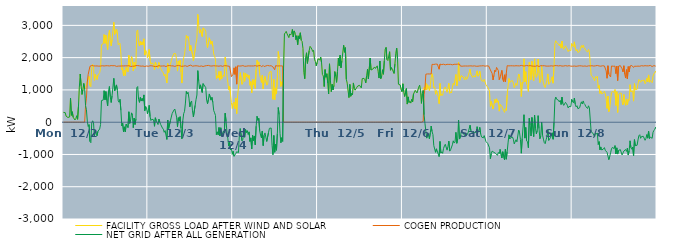
| Category | FACILITY GROSS LOAD AFTER WIND AND SOLAR | COGEN PRODUCTION | NET GRID AFTER ALL GENERATION |
|---|---|---|---|
|  Mon  12/2 | 303 | 0 | 303 |
|  Mon  12/2 | 291 | 0 | 291 |
|  Mon  12/2 | 296 | 0 | 296 |
|  Mon  12/2 | 187 | 0 | 187 |
|  Mon  12/2 | 184 | 0 | 184 |
|  Mon  12/2 | 147 | 0 | 147 |
|  Mon  12/2 | 121 | 0 | 121 |
|  Mon  12/2 | 161 | 0 | 161 |
|  Mon  12/2 | 748 | 0 | 748 |
|  Mon  12/2 | 212 | 0 | 212 |
|  Mon  12/2 | 324 | 0 | 324 |
|  Mon  12/2 | 153 | 0 | 153 |
|  Mon  12/2 | 135 | 0 | 135 |
|  Mon  12/2 | 69 | 0 | 69 |
|  Mon  12/2 | 108 | 0 | 108 |
|  Mon  12/2 | 201 | 0 | 201 |
|  Mon  12/2 | 88 | 0 | 88 |
|  Mon  12/2 | 494 | 0 | 494 |
|  Mon  12/2 | 1087 | 0 | 1087 |
|  Mon  12/2 | 1492 | 0 | 1492 |
|  Mon  12/2 | 1127 | 0 | 1127 |
|  Mon  12/2 | 860 | 0 | 860 |
|  Mon  12/2 | 1006 | 0 | 1006 |
|  Mon  12/2 | 1201 | 0 | 1201 |
|  Mon  12/2 | 1029 | 0 | 1029 |
|  Mon  12/2 | 1028 | 512 | 516 |
|  Mon  12/2 | 1132 | 745 | 387 |
|  Mon  12/2 | 1277 | 1244 | 33 |
|  Mon  12/2 | 1347 | 1481 | -134 |
|  Mon  12/2 | 1421 | 1496 | -75 |
|  Mon  12/2 | 1136 | 1732 | -596 |
|  Mon  12/2 | 1100 | 1735 | -635 |
|  Mon  12/2 | 1732 | 1757 | -25 |
|  Mon  12/2 | 1793 | 1750 | 43 |
|  Mon  12/2 | 1740 | 1745 | -5 |
|  Mon  12/2 | 1295 | 1733 | -438 |
|  Mon  12/2 | 1483 | 1742 | -259 |
|  Mon  12/2 | 1405 | 1735 | -330 |
|  Mon  12/2 | 1321 | 1743 | -422 |
|  Mon  12/2 | 1460 | 1743 | -283 |
|  Mon  12/2 | 1440 | 1736 | -296 |
|  Mon  12/2 | 1535 | 1745 | -210 |
|  Mon  12/2 | 1670 | 1739 | -69 |
|  Mon  12/2 | 2400 | 1731 | 669 |
|  Mon  12/2 | 2413 | 1749 | 664 |
|  Mon  12/2 | 2432 | 1747 | 685 |
|  Mon  12/2 | 2716 | 1741 | 975 |
|  Mon  12/2 | 2443 | 1750 | 693 |
|  Mon  12/2 | 2698 | 1749 | 949 |
|  Mon  12/2 | 2417 | 1745 | 672 |
|  Mon  12/2 | 2251 | 1749 | 502 |
|  Mon  12/2 | 2711 | 1751 | 960 |
|  Mon  12/2 | 2847 | 1742 | 1105 |
|  Mon  12/2 | 2526 | 1739 | 787 |
|  Mon  12/2 | 2364 | 1754 | 610 |
|  Mon  12/2 | 2557 | 1739 | 818 |
|  Mon  12/2 | 2836 | 1748 | 1088 |
|  Mon  12/2 | 3096 | 1738 | 1358 |
|  Mon  12/2 | 2723 | 1752 | 971 |
|  Mon  12/2 | 2697 | 1734 | 963 |
|  Mon  12/2 | 2884 | 1729 | 1155 |
|  Mon  12/2 | 2734 | 1747 | 987 |
|  Mon  12/2 | 2397 | 1738 | 659 |
|  Mon  12/2 | 2383 | 1766 | 617 |
|  Mon  12/2 | 2448 | 1739 | 709 |
|  Mon  12/2 | 2106 | 1740 | 366 |
|  Mon  12/2 | 1624 | 1742 | -118 |
|  Mon  12/2 | 1690 | 1720 | -30 |
|  Mon  12/2 | 1442 | 1743 | -301 |
|  Mon  12/2 | 1607 | 1751 | -144 |
|  Mon  12/2 | 1447 | 1746 | -299 |
|  Mon  12/2 | 1696 | 1754 | -58 |
|  Mon  12/2 | 1682 | 1745 | -63 |
|  Mon  12/2 | 1565 | 1733 | -168 |
|  Mon  12/2 | 2073 | 1751 | 322 |
|  Mon  12/2 | 1709 | 1746 | -37 |
|  Mon  12/2 | 1811 | 1726 | 85 |
|  Mon  12/2 | 2031 | 1743 | 288 |
|  Mon  12/2 | 1953 | 1733 | 220 |
|  Mon  12/2 | 1585 | 1755 | -170 |
|  Mon  12/2 | 1863 | 1737 | 126 |
|  Mon  12/2 | 1667 | 1739 | -72 |
|  Mon  12/2 | 1849 | 1753 | 96 |
|  Mon  12/2 | 2816 | 1746 | 1070 |
|  Mon  12/2 | 2858 | 1754 | 1104 |
|  Mon  12/2 | 2465 | 1763 | 702 |
|  Mon  12/2 | 2359 | 1745 | 614 |
|  Mon  12/2 | 2502 | 1734 | 768 |
|  Mon  12/2 | 2391 | 1736 | 655 |
|  Mon  12/2 | 2491 | 1746 | 745 |
|  Mon  12/2 | 2394 | 1741 | 653 |
|  Mon  12/2 | 2583 | 1738 | 845 |
|  Mon  12/2 | 2078 | 1724 | 354 |
|  Mon  12/2 | 2226 | 1739 | 487 |
|  Mon  12/2 | 2187 | 1742 | 445 |
|  Mon  12/2 | 2004 | 1744 | 260 |
|  Tue  12/3 | 2099 | 1732 | 367 |
|  Tue  12/3 | 2257 | 1734 | 523 |
|  Tue  12/3 | 1919 | 1748 | 171 |
|  Tue  12/3 | 1795 | 1743 | 52 |
|  Tue  12/3 | 1838 | 1746 | 92 |
|  Tue  12/3 | 1833 | 1744 | 89 |
|  Tue  12/3 | 1806 | 1734 | 72 |
|  Tue  12/3 | 1624 | 1751 | -127 |
|  Tue  12/3 | 1859 | 1722 | 137 |
|  Tue  12/3 | 1788 | 1740 | 48 |
|  Tue  12/3 | 1751 | 1728 | 23 |
|  Tue  12/3 | 1670 | 1743 | -73 |
|  Tue  12/3 | 1848 | 1752 | 96 |
|  Tue  12/3 | 1737 | 1738 | -1 |
|  Tue  12/3 | 1667 | 1738 | -71 |
|  Tue  12/3 | 1685 | 1729 | -44 |
|  Tue  12/3 | 1559 | 1741 | -182 |
|  Tue  12/3 | 1527 | 1743 | -216 |
|  Tue  12/3 | 1432 | 1745 | -313 |
|  Tue  12/3 | 1487 | 1748 | -261 |
|  Tue  12/3 | 1457 | 1724 | -267 |
|  Tue  12/3 | 1215 | 1749 | -534 |
|  Tue  12/3 | 1817 | 1751 | 66 |
|  Tue  12/3 | 1534 | 1732 | -198 |
|  Tue  12/3 | 1576 | 1756 | -180 |
|  Tue  12/3 | 1783 | 1740 | 43 |
|  Tue  12/3 | 1904 | 1745 | 159 |
|  Tue  12/3 | 2001 | 1733 | 268 |
|  Tue  12/3 | 2000 | 1744 | 256 |
|  Tue  12/3 | 2130 | 1754 | 376 |
|  Tue  12/3 | 2135 | 1728 | 407 |
|  Tue  12/3 | 2123 | 1741 | 382 |
|  Tue  12/3 | 1905 | 1749 | 156 |
|  Tue  12/3 | 1583 | 1724 | -141 |
|  Tue  12/3 | 1897 | 1758 | 139 |
|  Tue  12/3 | 1767 | 1735 | 32 |
|  Tue  12/3 | 1916 | 1746 | 170 |
|  Tue  12/3 | 1554 | 1737 | -183 |
|  Tue  12/3 | 1213 | 1729 | -516 |
|  Tue  12/3 | 1779 | 1740 | 39 |
|  Tue  12/3 | 2000 | 1738 | 262 |
|  Tue  12/3 | 2092 | 1755 | 337 |
|  Tue  12/3 | 2340 | 1748 | 592 |
|  Tue  12/3 | 2687 | 1735 | 952 |
|  Tue  12/3 | 2603 | 1727 | 876 |
|  Tue  12/3 | 2665 | 1739 | 926 |
|  Tue  12/3 | 2494 | 1751 | 743 |
|  Tue  12/3 | 2207 | 1732 | 475 |
|  Tue  12/3 | 2378 | 1767 | 611 |
|  Tue  12/3 | 2405 | 1748 | 657 |
|  Tue  12/3 | 2085 | 1734 | 351 |
|  Tue  12/3 | 1905 | 1744 | 161 |
|  Tue  12/3 | 1904 | 1744 | 160 |
|  Tue  12/3 | 2265 | 1743 | 522 |
|  Tue  12/3 | 2450 | 1748 | 702 |
|  Tue  12/3 | 2589 | 1747 | 842 |
|  Tue  12/3 | 3339 | 1742 | 1597 |
|  Tue  12/3 | 3026 | 1743 | 1283 |
|  Tue  12/3 | 2759 | 1730 | 1029 |
|  Tue  12/3 | 2878 | 1722 | 1156 |
|  Tue  12/3 | 2878 | 1743 | 1135 |
|  Tue  12/3 | 2654 | 1733 | 921 |
|  Tue  12/3 | 2920 | 1724 | 1196 |
|  Tue  12/3 | 2902 | 1749 | 1153 |
|  Tue  12/3 | 2880 | 1742 | 1138 |
|  Tue  12/3 | 2819 | 1749 | 1070 |
|  Tue  12/3 | 2436 | 1752 | 684 |
|  Tue  12/3 | 2312 | 1740 | 572 |
|  Tue  12/3 | 2468 | 1759 | 709 |
|  Tue  12/3 | 2615 | 1740 | 875 |
|  Tue  12/3 | 2621 | 1742 | 879 |
|  Tue  12/3 | 2414 | 1732 | 682 |
|  Tue  12/3 | 2512 | 1740 | 772 |
|  Tue  12/3 | 2360 | 1748 | 612 |
|  Tue  12/3 | 2108 | 1749 | 359 |
|  Tue  12/3 | 2036 | 1745 | 291 |
|  Tue  12/3 | 1952 | 1744 | 208 |
|  Tue  12/3 | 1350 | 1736 | -386 |
|  Tue  12/3 | 1443 | 1741 | -298 |
|  Tue  12/3 | 1367 | 1760 | -393 |
|  Tue  12/3 | 1570 | 1735 | -165 |
|  Tue  12/3 | 1302 | 1730 | -428 |
|  Tue  12/3 | 1575 | 1748 | -173 |
|  Tue  12/3 | 1341 | 1754 | -413 |
|  Tue  12/3 | 1385 | 1730 | -345 |
|  Tue  12/3 | 1467 | 1740 | -273 |
|  Tue  12/3 | 1418 | 1750 | -332 |
|  Tue  12/3 | 2014 | 1736 | 278 |
|  Tue  12/3 | 1773 | 1749 | 24 |
|  Tue  12/3 | 1424 | 1743 | -319 |
|  Tue  12/3 | 1223 | 1738 | -515 |
|  Tue  12/3 | 1010 | 1751 | -741 |
|  Tue  12/3 | 1107 | 1731 | -624 |
|  Tue  12/3 | 869 | 1727 | -858 |
|  Tue  12/3 | 606 | 1411 | -805 |
|  Tue  12/3 | 426 | 1422 | -996 |
|  Wed  12/4 | 582 | 1486 | -904 |
|  Wed  12/4 | 627 | 1684 | -1057 |
|  Wed  12/4 | 417 | 1481 | -1064 |
|  Wed  12/4 | 748 | 1717 | -969 |
|  Wed  12/4 | 264 | 1179 | -915 |
|  Wed  12/4 | 805 | 1746 | -941 |
|  Wed  12/4 | 805 | 1748 | -943 |
|  Wed  12/4 | 1332 | 1739 | -407 |
|  Wed  12/4 | 1536 | 1735 | -199 |
|  Wed  12/4 | 1542 | 1741 | -199 |
|  Wed  12/4 | 1172 | 1746 | -574 |
|  Wed  12/4 | 1220 | 1753 | -533 |
|  Wed  12/4 | 1533 | 1758 | -225 |
|  Wed  12/4 | 1266 | 1732 | -466 |
|  Wed  12/4 | 1524 | 1751 | -227 |
|  Wed  12/4 | 1413 | 1735 | -322 |
|  Wed  12/4 | 1480 | 1741 | -261 |
|  Wed  12/4 | 1361 | 1745 | -384 |
|  Wed  12/4 | 1451 | 1750 | -299 |
|  Wed  12/4 | 1145 | 1742 | -597 |
|  Wed  12/4 | 1257 | 1744 | -487 |
|  Wed  12/4 | 913 | 1742 | -829 |
|  Wed  12/4 | 1324 | 1732 | -408 |
|  Wed  12/4 | 1170 | 1742 | -572 |
|  Wed  12/4 | 1312 | 1739 | -427 |
|  Wed  12/4 | 1050 | 1752 | -702 |
|  Wed  12/4 | 1631 | 1755 | -124 |
|  Wed  12/4 | 1919 | 1736 | 183 |
|  Wed  12/4 | 1788 | 1733 | 55 |
|  Wed  12/4 | 1871 | 1751 | 120 |
|  Wed  12/4 | 1478 | 1743 | -265 |
|  Wed  12/4 | 1354 | 1753 | -399 |
|  Wed  12/4 | 1231 | 1720 | -489 |
|  Wed  12/4 | 1459 | 1732 | -273 |
|  Wed  12/4 | 1030 | 1756 | -726 |
|  Wed  12/4 | 1315 | 1724 | -409 |
|  Wed  12/4 | 1416 | 1748 | -332 |
|  Wed  12/4 | 1415 | 1742 | -327 |
|  Wed  12/4 | 1148 | 1745 | -597 |
|  Wed  12/4 | 1180 | 1758 | -578 |
|  Wed  12/4 | 1427 | 1748 | -321 |
|  Wed  12/4 | 1554 | 1745 | -191 |
|  Wed  12/4 | 1553 | 1747 | -194 |
|  Wed  12/4 | 1569 | 1749 | -180 |
|  Wed  12/4 | 1034 | 1752 | -718 |
|  Wed  12/4 | 707 | 1714 | -1007 |
|  Wed  12/4 | 1328 | 1740 | -412 |
|  Wed  12/4 | 694 | 1626 | -932 |
|  Wed  12/4 | 1063 | 1751 | -688 |
|  Wed  12/4 | 872 | 1742 | -870 |
|  Wed  12/4 | 1391 | 1742 | -351 |
|  Wed  12/4 | 2190 | 1736 | 454 |
|  Wed  12/4 | 1981 | 1744 | 237 |
|  Wed  12/4 | 1390 | 1734 | -344 |
|  Wed  12/4 | 1106 | 1744 | -638 |
|  Wed  12/4 | 1252 | 1732 | -480 |
|  Wed  12/4 | 1148 | 1742 | -594 |
|  Wed  12/4 | 1646 | 0 | 1646 |
|  Wed  12/4 | 2733 | 0 | 2733 |
|  Wed  12/4 | 2771 | 0 | 2771 |
|  Wed  12/4 | 2813 | 0 | 2813 |
|  Wed  12/4 | 2739 | 0 | 2739 |
|  Wed  12/4 | 2721 | 0 | 2721 |
|  Wed  12/4 | 2621 | 0 | 2621 |
|  Wed  12/4 | 2735 | 0 | 2735 |
|  Wed  12/4 | 2699 | 0 | 2699 |
|  Wed  12/4 | 2751 | 0 | 2751 |
|  Wed  12/4 | 2873 | 0 | 2873 |
|  Wed  12/4 | 2640 | 0 | 2640 |
|  Wed  12/4 | 2829 | 0 | 2829 |
|  Wed  12/4 | 2769 | 0 | 2769 |
|  Wed  12/4 | 2556 | 0 | 2556 |
|  Wed  12/4 | 2679 | 0 | 2679 |
|  Wed  12/4 | 2401 | 0 | 2401 |
|  Wed  12/4 | 2674 | 0 | 2674 |
|  Wed  12/4 | 2589 | 0 | 2589 |
|  Wed  12/4 | 2770 | 0 | 2770 |
|  Wed  12/4 | 2536 | 0 | 2536 |
|  Wed  12/4 | 2502 | 0 | 2502 |
|  Wed  12/4 | 2280 | 0 | 2280 |
|  Wed  12/4 | 1541 | 0 | 1541 |
|  Wed  12/4 | 1347 | 0 | 1347 |
|  Wed  12/4 | 1995 | 0 | 1995 |
|  Wed  12/4 | 2150 | 0 | 2150 |
|  Wed  12/4 | 1821 | 0 | 1821 |
|  Wed  12/4 | 1804 | 0 | 1804 |
|  Wed  12/4 | 2217 | 0 | 2217 |
|  Wed  12/4 | 2348 | 0 | 2348 |
|  Wed  12/4 | 2312 | 0 | 2312 |
|  Wed  12/4 | 2263 | 0 | 2263 |
|  Wed  12/4 | 2191 | 0 | 2191 |
|  Wed  12/4 | 2225 | 0 | 2225 |
|  Wed  12/4 | 1951 | 0 | 1951 |
|  Wed  12/4 | 1880 | 0 | 1880 |
|  Wed  12/4 | 1747 | 0 | 1747 |
|  Wed  12/4 | 1847 | 0 | 1847 |
|  Thu  12/5 | 1964 | 0 | 1964 |
|  Thu  12/5 | 1984 | 0 | 1984 |
|  Thu  12/5 | 1928 | 0 | 1928 |
|  Thu  12/5 | 2014 | 0 | 2014 |
|  Thu  12/5 | 1844 | 0 | 1844 |
|  Thu  12/5 | 1475 | 0 | 1475 |
|  Thu  12/5 | 1434 | 0 | 1434 |
|  Thu  12/5 | 1105 | 0 | 1105 |
|  Thu  12/5 | 1630 | 0 | 1630 |
|  Thu  12/5 | 1392 | 0 | 1392 |
|  Thu  12/5 | 1501 | 0 | 1501 |
|  Thu  12/5 | 1212 | 0 | 1212 |
|  Thu  12/5 | 874 | 0 | 874 |
|  Thu  12/5 | 1808 | 0 | 1808 |
|  Thu  12/5 | 1310 | 0 | 1310 |
|  Thu  12/5 | 946 | 0 | 946 |
|  Thu  12/5 | 1173 | 0 | 1173 |
|  Thu  12/5 | 1003 | 0 | 1003 |
|  Thu  12/5 | 1140 | 0 | 1140 |
|  Thu  12/5 | 1568 | 0 | 1568 |
|  Thu  12/5 | 1431 | 0 | 1431 |
|  Thu  12/5 | 1234 | 0 | 1234 |
|  Thu  12/5 | 1570 | 0 | 1570 |
|  Thu  12/5 | 1986 | 0 | 1986 |
|  Thu  12/5 | 1747 | 0 | 1747 |
|  Thu  12/5 | 2075 | 0 | 2075 |
|  Thu  12/5 | 1685 | 0 | 1685 |
|  Thu  12/5 | 1906 | 0 | 1906 |
|  Thu  12/5 | 1924 | 0 | 1924 |
|  Thu  12/5 | 2383 | 0 | 2383 |
|  Thu  12/5 | 2166 | 0 | 2166 |
|  Thu  12/5 | 2309 | 0 | 2309 |
|  Thu  12/5 | 1330 | 0 | 1330 |
|  Thu  12/5 | 1211 | 0 | 1211 |
|  Thu  12/5 | 1219 | 0 | 1219 |
|  Thu  12/5 | 763 | 0 | 763 |
|  Thu  12/5 | 1169 | 0 | 1169 |
|  Thu  12/5 | 803 | 0 | 803 |
|  Thu  12/5 | 889 | 0 | 889 |
|  Thu  12/5 | 847 | 0 | 847 |
|  Thu  12/5 | 1216 | 0 | 1216 |
|  Thu  12/5 | 1041 | 0 | 1041 |
|  Thu  12/5 | 992 | 0 | 992 |
|  Thu  12/5 | 995 | 0 | 995 |
|  Thu  12/5 | 1084 | 0 | 1084 |
|  Thu  12/5 | 1122 | 0 | 1122 |
|  Thu  12/5 | 1117 | 0 | 1117 |
|  Thu  12/5 | 1141 | 0 | 1141 |
|  Thu  12/5 | 1160 | 0 | 1160 |
|  Thu  12/5 | 1062 | 0 | 1062 |
|  Thu  12/5 | 1349 | 0 | 1349 |
|  Thu  12/5 | 1344 | 0 | 1344 |
|  Thu  12/5 | 1358 | 0 | 1358 |
|  Thu  12/5 | 1315 | 0 | 1315 |
|  Thu  12/5 | 1218 | 0 | 1218 |
|  Thu  12/5 | 1440 | 0 | 1440 |
|  Thu  12/5 | 1639 | 0 | 1639 |
|  Thu  12/5 | 1339 | 0 | 1339 |
|  Thu  12/5 | 1366 | 0 | 1366 |
|  Thu  12/5 | 1985 | 0 | 1985 |
|  Thu  12/5 | 1616 | 0 | 1616 |
|  Thu  12/5 | 1596 | 0 | 1596 |
|  Thu  12/5 | 1644 | 0 | 1644 |
|  Thu  12/5 | 1632 | 0 | 1632 |
|  Thu  12/5 | 1711 | 0 | 1711 |
|  Thu  12/5 | 1666 | 0 | 1666 |
|  Thu  12/5 | 1645 | 0 | 1645 |
|  Thu  12/5 | 1746 | 0 | 1746 |
|  Thu  12/5 | 1576 | 0 | 1576 |
|  Thu  12/5 | 1368 | 0 | 1368 |
|  Thu  12/5 | 1895 | 0 | 1895 |
|  Thu  12/5 | 1349 | 0 | 1349 |
|  Thu  12/5 | 1425 | 0 | 1425 |
|  Thu  12/5 | 1625 | 0 | 1625 |
|  Thu  12/5 | 1485 | 0 | 1485 |
|  Thu  12/5 | 1899 | 0 | 1899 |
|  Thu  12/5 | 2258 | 0 | 2258 |
|  Thu  12/5 | 2317 | 0 | 2317 |
|  Thu  12/5 | 1942 | 0 | 1942 |
|  Thu  12/5 | 1910 | 0 | 1910 |
|  Thu  12/5 | 1892 | 0 | 1892 |
|  Thu  12/5 | 2183 | 0 | 2183 |
|  Thu  12/5 | 1611 | 0 | 1611 |
|  Thu  12/5 | 1691 | 0 | 1691 |
|  Thu  12/5 | 1642 | 0 | 1642 |
|  Thu  12/5 | 1631 | 0 | 1631 |
|  Thu  12/5 | 1511 | 0 | 1511 |
|  Thu  12/5 | 1799 | 0 | 1799 |
|  Thu  12/5 | 2138 | 0 | 2138 |
|  Thu  12/5 | 2296 | 0 | 2296 |
|  Thu  12/5 | 1937 | 0 | 1937 |
|  Thu  12/5 | 1177 | 0 | 1177 |
|  Thu  12/5 | 1175 | 0 | 1175 |
|  Thu  12/5 | 1154 | 0 | 1154 |
|  Thu  12/5 | 1012 | 0 | 1012 |
|  Thu  12/5 | 945 | 0 | 945 |
|  Fri  12/6 | 1189 | 0 | 1189 |
|  Fri  12/6 | 944 | 0 | 944 |
|  Fri  12/6 | 796 | 0 | 796 |
|  Fri  12/6 | 800 | 0 | 800 |
|  Fri  12/6 | 1041 | 0 | 1041 |
|  Fri  12/6 | 561 | 0 | 561 |
|  Fri  12/6 | 784 | 0 | 784 |
|  Fri  12/6 | 607 | 0 | 607 |
|  Fri  12/6 | 649 | 0 | 649 |
|  Fri  12/6 | 591 | 0 | 591 |
|  Fri  12/6 | 712 | 0 | 712 |
|  Fri  12/6 | 629 | 0 | 629 |
|  Fri  12/6 | 870 | 0 | 870 |
|  Fri  12/6 | 889 | 0 | 889 |
|  Fri  12/6 | 984 | 0 | 984 |
|  Fri  12/6 | 971 | 0 | 971 |
|  Fri  12/6 | 906 | 0 | 906 |
|  Fri  12/6 | 908 | 0 | 908 |
|  Fri  12/6 | 1088 | 0 | 1088 |
|  Fri  12/6 | 1147 | 0 | 1147 |
|  Fri  12/6 | 972 | 0 | 972 |
|  Fri  12/6 | 584 | 0 | 584 |
|  Fri  12/6 | 888 | 0 | 888 |
|  Fri  12/6 | 1004 | 22 | 982 |
|  Fri  12/6 | 1078 | 848 | 230 |
|  Fri  12/6 | 1001 | 1043 | -42 |
|  Fri  12/6 | 1206 | 1488 | -282 |
|  Fri  12/6 | 1007 | 1501 | -494 |
|  Fri  12/6 | 1160 | 1495 | -335 |
|  Fri  12/6 | 1093 | 1502 | -409 |
|  Fri  12/6 | 978 | 1494 | -516 |
|  Fri  12/6 | 1145 | 1483 | -338 |
|  Fri  12/6 | 1373 | 1493 | -120 |
|  Fri  12/6 | 1503 | 1792 | -289 |
|  Fri  12/6 | 1396 | 1780 | -384 |
|  Fri  12/6 | 1061 | 1789 | -728 |
|  Fri  12/6 | 1095 | 1799 | -704 |
|  Fri  12/6 | 866 | 1799 | -933 |
|  Fri  12/6 | 977 | 1802 | -825 |
|  Fri  12/6 | 955 | 1798 | -843 |
|  Fri  12/6 | 790 | 1779 | -989 |
|  Fri  12/6 | 575 | 1641 | -1066 |
|  Fri  12/6 | 1200 | 1798 | -598 |
|  Fri  12/6 | 823 | 1781 | -958 |
|  Fri  12/6 | 866 | 1785 | -919 |
|  Fri  12/6 | 830 | 1796 | -966 |
|  Fri  12/6 | 981 | 1796 | -815 |
|  Fri  12/6 | 1060 | 1795 | -735 |
|  Fri  12/6 | 1092 | 1777 | -685 |
|  Fri  12/6 | 1080 | 1787 | -707 |
|  Fri  12/6 | 926 | 1793 | -867 |
|  Fri  12/6 | 1046 | 1799 | -753 |
|  Fri  12/6 | 1203 | 1790 | -587 |
|  Fri  12/6 | 895 | 1791 | -896 |
|  Fri  12/6 | 938 | 1792 | -854 |
|  Fri  12/6 | 904 | 1786 | -882 |
|  Fri  12/6 | 1075 | 1777 | -702 |
|  Fri  12/6 | 1207 | 1784 | -577 |
|  Fri  12/6 | 1147 | 1794 | -647 |
|  Fri  12/6 | 1174 | 1790 | -616 |
|  Fri  12/6 | 1478 | 1793 | -315 |
|  Fri  12/6 | 1126 | 1780 | -654 |
|  Fri  12/6 | 1277 | 1799 | -522 |
|  Fri  12/6 | 1864 | 1798 | 66 |
|  Fri  12/6 | 1278 | 1801 | -523 |
|  Fri  12/6 | 1271 | 1740 | -469 |
|  Fri  12/6 | 1441 | 1740 | -299 |
|  Fri  12/6 | 1424 | 1734 | -310 |
|  Fri  12/6 | 1404 | 1736 | -332 |
|  Fri  12/6 | 1363 | 1740 | -377 |
|  Fri  12/6 | 1310 | 1726 | -416 |
|  Fri  12/6 | 1409 | 1741 | -332 |
|  Fri  12/6 | 1326 | 1734 | -408 |
|  Fri  12/6 | 1364 | 1739 | -375 |
|  Fri  12/6 | 1443 | 1751 | -308 |
|  Fri  12/6 | 1420 | 1742 | -322 |
|  Fri  12/6 | 1642 | 1736 | -94 |
|  Fri  12/6 | 1479 | 1745 | -266 |
|  Fri  12/6 | 1473 | 1749 | -276 |
|  Fri  12/6 | 1387 | 1738 | -351 |
|  Fri  12/6 | 1438 | 1722 | -284 |
|  Fri  12/6 | 1419 | 1745 | -326 |
|  Fri  12/6 | 1399 | 1736 | -337 |
|  Fri  12/6 | 1426 | 1733 | -307 |
|  Fri  12/6 | 1592 | 1732 | -140 |
|  Fri  12/6 | 1424 | 1735 | -311 |
|  Fri  12/6 | 1476 | 1736 | -260 |
|  Fri  12/6 | 1583 | 1743 | -160 |
|  Fri  12/6 | 1386 | 1745 | -359 |
|  Fri  12/6 | 1286 | 1745 | -459 |
|  Fri  12/6 | 1264 | 1749 | -485 |
|  Fri  12/6 | 1265 | 1750 | -485 |
|  Fri  12/6 | 1328 | 1744 | -416 |
|  Fri  12/6 | 1343 | 1736 | -393 |
|  Fri  12/6 | 1156 | 1755 | -599 |
|  Fri  12/6 | 1166 | 1745 | -579 |
|  Sat  12/7 | 1084 | 1744 | -660 |
|  Sat  12/7 | 1081 | 1741 | -660 |
|  Sat  12/7 | 961 | 1754 | -793 |
|  Sat  12/7 | 490 | 1620 | -1130 |
|  Sat  12/7 | 641 | 1616 | -975 |
|  Sat  12/7 | 612 | 1508 | -896 |
|  Sat  12/7 | 411 | 1309 | -898 |
|  Sat  12/7 | 514 | 1449 | -935 |
|  Sat  12/7 | 708 | 1616 | -908 |
|  Sat  12/7 | 596 | 1564 | -968 |
|  Sat  12/7 | 723 | 1697 | -974 |
|  Sat  12/7 | 620 | 1648 | -1028 |
|  Sat  12/7 | 661 | 1599 | -938 |
|  Sat  12/7 | 342 | 1318 | -976 |
|  Sat  12/7 | 547 | 1390 | -843 |
|  Sat  12/7 | 520 | 1383 | -863 |
|  Sat  12/7 | 497 | 1605 | -1108 |
|  Sat  12/7 | 411 | 1326 | -915 |
|  Sat  12/7 | 359 | 1256 | -897 |
|  Sat  12/7 | 304 | 1467 | -1163 |
|  Sat  12/7 | 420 | 1252 | -832 |
|  Sat  12/7 | 363 | 1511 | -1148 |
|  Sat  12/7 | 839 | 1751 | -912 |
|  Sat  12/7 | 1110 | 1752 | -642 |
|  Sat  12/7 | 1352 | 1744 | -392 |
|  Sat  12/7 | 1235 | 1754 | -519 |
|  Sat  12/7 | 1274 | 1748 | -474 |
|  Sat  12/7 | 1264 | 1737 | -473 |
|  Sat  12/7 | 1286 | 1747 | -461 |
|  Sat  12/7 | 1208 | 1736 | -528 |
|  Sat  12/7 | 1070 | 1743 | -673 |
|  Sat  12/7 | 1084 | 1742 | -658 |
|  Sat  12/7 | 1206 | 1749 | -543 |
|  Sat  12/7 | 1137 | 1745 | -608 |
|  Sat  12/7 | 1139 | 1746 | -607 |
|  Sat  12/7 | 1493 | 1739 | -246 |
|  Sat  12/7 | 1417 | 1744 | -327 |
|  Sat  12/7 | 1220 | 1752 | -532 |
|  Sat  12/7 | 798 | 1759 | -961 |
|  Sat  12/7 | 1239 | 1745 | -506 |
|  Sat  12/7 | 1208 | 1743 | -535 |
|  Sat  12/7 | 1964 | 1733 | 231 |
|  Sat  12/7 | 1249 | 1743 | -494 |
|  Sat  12/7 | 1566 | 1730 | -164 |
|  Sat  12/7 | 1181 | 1757 | -576 |
|  Sat  12/7 | 1140 | 1750 | -610 |
|  Sat  12/7 | 953 | 1745 | -792 |
|  Sat  12/7 | 1853 | 1734 | 119 |
|  Sat  12/7 | 1671 | 1754 | -83 |
|  Sat  12/7 | 1315 | 1743 | -428 |
|  Sat  12/7 | 1886 | 1740 | 146 |
|  Sat  12/7 | 1907 | 1732 | 175 |
|  Sat  12/7 | 1289 | 1735 | -446 |
|  Sat  12/7 | 1961 | 1743 | 218 |
|  Sat  12/7 | 1545 | 1732 | -187 |
|  Sat  12/7 | 1390 | 1752 | -362 |
|  Sat  12/7 | 1492 | 1752 | -260 |
|  Sat  12/7 | 1954 | 1752 | 202 |
|  Sat  12/7 | 1525 | 1722 | -197 |
|  Sat  12/7 | 1230 | 1743 | -513 |
|  Sat  12/7 | 1319 | 1752 | -433 |
|  Sat  12/7 | 1730 | 1731 | -1 |
|  Sat  12/7 | 1348 | 1748 | -400 |
|  Sat  12/7 | 1218 | 1743 | -525 |
|  Sat  12/7 | 1115 | 1749 | -634 |
|  Sat  12/7 | 1073 | 1739 | -666 |
|  Sat  12/7 | 1191 | 1738 | -547 |
|  Sat  12/7 | 1307 | 1757 | -450 |
|  Sat  12/7 | 1495 | 1737 | -242 |
|  Sat  12/7 | 1174 | 1738 | -564 |
|  Sat  12/7 | 1220 | 1739 | -519 |
|  Sat  12/7 | 1256 | 1741 | -485 |
|  Sat  12/7 | 1271 | 1747 | -476 |
|  Sat  12/7 | 1408 | 1737 | -329 |
|  Sat  12/7 | 1208 | 1737 | -529 |
|  Sat  12/7 | 1749 | 1749 | 0 |
|  Sat  12/7 | 2440 | 1753 | 687 |
|  Sat  12/7 | 2525 | 1746 | 779 |
|  Sat  12/7 | 2462 | 1752 | 710 |
|  Sat  12/7 | 2462 | 1753 | 709 |
|  Sat  12/7 | 2424 | 1743 | 681 |
|  Sat  12/7 | 2365 | 1737 | 628 |
|  Sat  12/7 | 2430 | 1752 | 678 |
|  Sat  12/7 | 2294 | 1747 | 547 |
|  Sat  12/7 | 2515 | 1738 | 777 |
|  Sat  12/7 | 2310 | 1737 | 573 |
|  Sat  12/7 | 2260 | 1740 | 520 |
|  Sat  12/7 | 2269 | 1741 | 528 |
|  Sat  12/7 | 2366 | 1752 | 614 |
|  Sat  12/7 | 2313 | 1735 | 578 |
|  Sat  12/7 | 2264 | 1739 | 525 |
|  Sat  12/7 | 2187 | 1744 | 443 |
|  Sat  12/7 | 2239 | 1751 | 488 |
|  Sat  12/7 | 2240 | 1726 | 514 |
|  Sat  12/7 | 2217 | 1736 | 481 |
|  Sat  12/7 | 2437 | 1731 | 706 |
|  Sun  12/8 | 2372 | 1734 | 638 |
|  Sun  12/8 | 2337 | 1736 | 601 |
|  Sun  12/8 | 2489 | 1740 | 749 |
|  Sun  12/8 | 2296 | 1738 | 558 |
|  Sun  12/8 | 2206 | 1731 | 475 |
|  Sun  12/8 | 2255 | 1746 | 509 |
|  Sun  12/8 | 2159 | 1740 | 419 |
|  Sun  12/8 | 2155 | 1741 | 414 |
|  Sun  12/8 | 2196 | 1748 | 448 |
|  Sun  12/8 | 2299 | 1748 | 551 |
|  Sun  12/8 | 2375 | 1744 | 631 |
|  Sun  12/8 | 2306 | 1744 | 562 |
|  Sun  12/8 | 2393 | 1735 | 658 |
|  Sun  12/8 | 2310 | 1734 | 576 |
|  Sun  12/8 | 2287 | 1742 | 545 |
|  Sun  12/8 | 2232 | 1752 | 480 |
|  Sun  12/8 | 2236 | 1731 | 505 |
|  Sun  12/8 | 2171 | 1745 | 426 |
|  Sun  12/8 | 2254 | 1746 | 508 |
|  Sun  12/8 | 2179 | 1736 | 443 |
|  Sun  12/8 | 2184 | 1744 | 440 |
|  Sun  12/8 | 1450 | 1746 | -296 |
|  Sun  12/8 | 1446 | 1749 | -303 |
|  Sun  12/8 | 1398 | 1739 | -341 |
|  Sun  12/8 | 1372 | 1738 | -366 |
|  Sun  12/8 | 1285 | 1733 | -448 |
|  Sun  12/8 | 1412 | 1747 | -335 |
|  Sun  12/8 | 1370 | 1742 | -372 |
|  Sun  12/8 | 1423 | 1757 | -334 |
|  Sun  12/8 | 1054 | 1745 | -691 |
|  Sun  12/8 | 1140 | 1742 | -602 |
|  Sun  12/8 | 892 | 1747 | -855 |
|  Sun  12/8 | 967 | 1735 | -768 |
|  Sun  12/8 | 875 | 1737 | -862 |
|  Sun  12/8 | 899 | 1749 | -850 |
|  Sun  12/8 | 922 | 1751 | -829 |
|  Sun  12/8 | 954 | 1742 | -788 |
|  Sun  12/8 | 873 | 1745 | -872 |
|  Sun  12/8 | 724 | 1588 | -864 |
|  Sun  12/8 | 426 | 1361 | -935 |
|  Sun  12/8 | 810 | 1749 | -939 |
|  Sun  12/8 | 328 | 1488 | -1160 |
|  Sun  12/8 | 433 | 1494 | -1061 |
|  Sun  12/8 | 454 | 1401 | -947 |
|  Sun  12/8 | 913 | 1741 | -828 |
|  Sun  12/8 | 952 | 1735 | -783 |
|  Sun  12/8 | 952 | 1733 | -781 |
|  Sun  12/8 | 926 | 1742 | -816 |
|  Sun  12/8 | 1011 | 1736 | -725 |
|  Sun  12/8 | 519 | 1505 | -986 |
|  Sun  12/8 | 944 | 1739 | -795 |
|  Sun  12/8 | 303 | 1291 | -988 |
|  Sun  12/8 | 858 | 1735 | -877 |
|  Sun  12/8 | 892 | 1753 | -861 |
|  Sun  12/8 | 903 | 1753 | -850 |
|  Sun  12/8 | 901 | 1751 | -850 |
|  Sun  12/8 | 639 | 1654 | -1015 |
|  Sun  12/8 | 539 | 1560 | -1021 |
|  Sun  12/8 | 854 | 1748 | -894 |
|  Sun  12/8 | 614 | 1483 | -869 |
|  Sun  12/8 | 522 | 1368 | -846 |
|  Sun  12/8 | 722 | 1627 | -905 |
|  Sun  12/8 | 535 | 1340 | -805 |
|  Sun  12/8 | 704 | 1722 | -1018 |
|  Sun  12/8 | 671 | 1557 | -886 |
|  Sun  12/8 | 1162 | 1739 | -577 |
|  Sun  12/8 | 943 | 1735 | -792 |
|  Sun  12/8 | 918 | 1757 | -839 |
|  Sun  12/8 | 970 | 1741 | -771 |
|  Sun  12/8 | 652 | 1695 | -1043 |
|  Sun  12/8 | 1195 | 1736 | -541 |
|  Sun  12/8 | 1006 | 1733 | -727 |
|  Sun  12/8 | 1010 | 1732 | -722 |
|  Sun  12/8 | 1020 | 1734 | -714 |
|  Sun  12/8 | 1186 | 1737 | -551 |
|  Sun  12/8 | 1324 | 1744 | -420 |
|  Sun  12/8 | 1346 | 1734 | -388 |
|  Sun  12/8 | 1238 | 1738 | -500 |
|  Sun  12/8 | 1306 | 1751 | -445 |
|  Sun  12/8 | 1275 | 1737 | -462 |
|  Sun  12/8 | 1302 | 1741 | -439 |
|  Sun  12/8 | 1311 | 1744 | -433 |
|  Sun  12/8 | 1190 | 1751 | -561 |
|  Sun  12/8 | 1242 | 1744 | -502 |
|  Sun  12/8 | 1360 | 1745 | -385 |
|  Sun  12/8 | 1251 | 1746 | -495 |
|  Sun  12/8 | 1464 | 1746 | -282 |
|  Sun  12/8 | 1238 | 1746 | -508 |
|  Sun  12/8 | 1296 | 1758 | -462 |
|  Sun  12/8 | 1260 | 1748 | -488 |
|  Sun  12/8 | 1224 | 1724 | -500 |
|  Sun  12/8 | 1429 | 1742 | -313 |
|  Sun  12/8 | 1496 | 1753 | -257 |
|  Sun  12/8 | 1523 | 1743 | -220 |
|  Sun  12/8 | 1579 | 1736 | -157 |
|  Sun  12/8 | 1513 | 1737 | -224 |